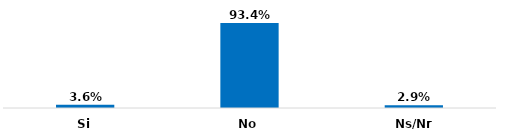
| Category | Series 0 |
|---|---|
| Si | 0.036 |
| No | 0.934 |
| Ns/Nr | 0.029 |